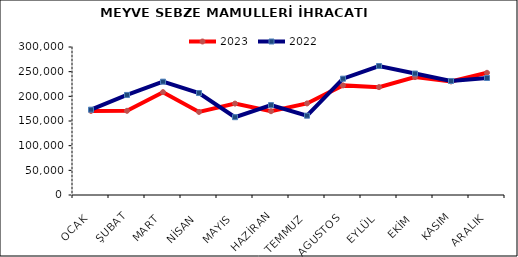
| Category | 2023 | 2022 |
|---|---|---|
| OCAK | 170441.55 | 172966.688 |
| ŞUBAT | 170702.457 | 202800.776 |
| MART | 208485.475 | 229732.798 |
| NİSAN | 168426.208 | 206672.238 |
| MAYIS | 185263.852 | 157716.621 |
| HAZİRAN | 169846.251 | 182173.973 |
| TEMMUZ | 185604.19 | 160742.929 |
| AGUSTOS | 222177.364 | 235788.688 |
| EYLÜL | 218653.617 | 261484.118 |
| EKİM | 238947.317 | 246193.944 |
| KASIM | 230182.976 | 231119.849 |
| ARALIK | 247711.638 | 237137.171 |